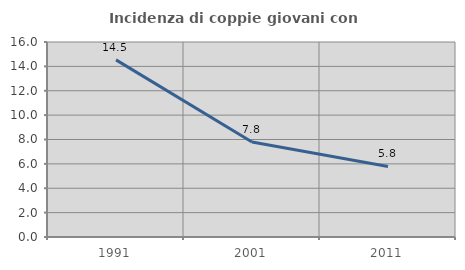
| Category | Incidenza di coppie giovani con figli |
|---|---|
| 1991.0 | 14.534 |
| 2001.0 | 7.795 |
| 2011.0 | 5.787 |